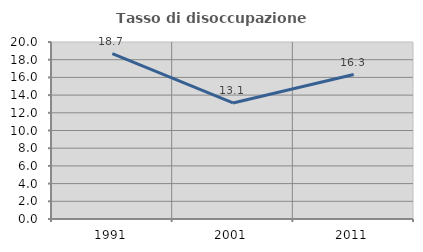
| Category | Tasso di disoccupazione giovanile  |
|---|---|
| 1991.0 | 18.681 |
| 2001.0 | 13.115 |
| 2011.0 | 16.327 |